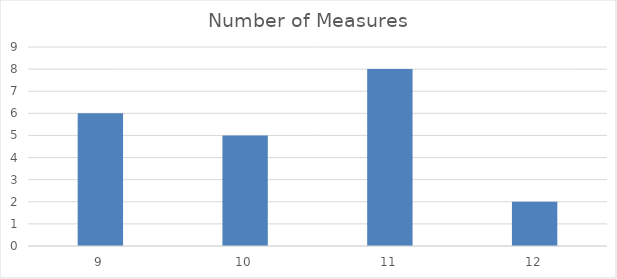
| Category | Number of Measures |
|---|---|
| 9.0 | 6 |
| 10.0 | 5 |
| 11.0 | 8 |
| 12.0 | 2 |